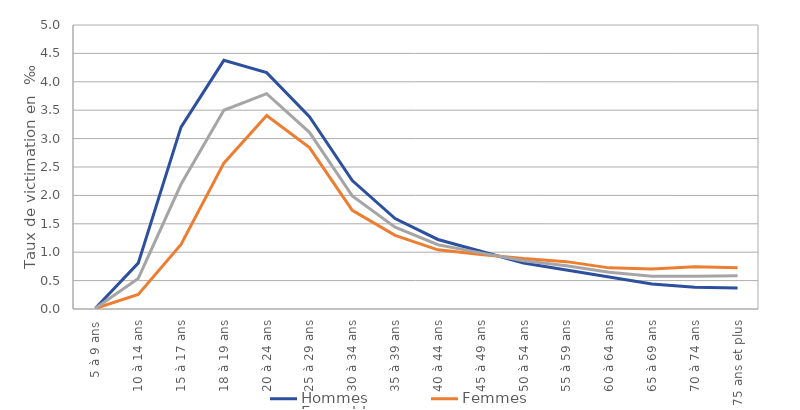
| Category | Hommes | Femmes | Ensemble |
|---|---|---|---|
| 5 à 9 ans | 0.014 | 0.009 | 0.012 |
| 10 à 14 ans | 0.807 | 0.258 | 0.539 |
| 15 à 17 ans | 3.201 | 1.136 | 2.196 |
| 18 à 19 ans | 4.377 | 2.568 | 3.499 |
| 20 à 24 ans | 4.162 | 3.408 | 3.79 |
| 25 à 29 ans | 3.385 | 2.841 | 3.11 |
| 30 à 34 ans | 2.26 | 1.737 | 1.992 |
| 35 à 39 ans | 1.592 | 1.296 | 1.44 |
| 40 à 44 ans | 1.224 | 1.042 | 1.132 |
| 45 à 49 ans | 1.017 | 0.96 | 0.988 |
| 50 à 54 ans | 0.81 | 0.887 | 0.849 |
| 55 à 59 ans | 0.687 | 0.834 | 0.763 |
| 60 à 64 ans | 0.562 | 0.724 | 0.647 |
| 65 à 69 ans | 0.438 | 0.703 | 0.578 |
| 70 à 74 ans | 0.385 | 0.745 | 0.578 |
| 75 ans et plus | 0.368 | 0.726 | 0.587 |